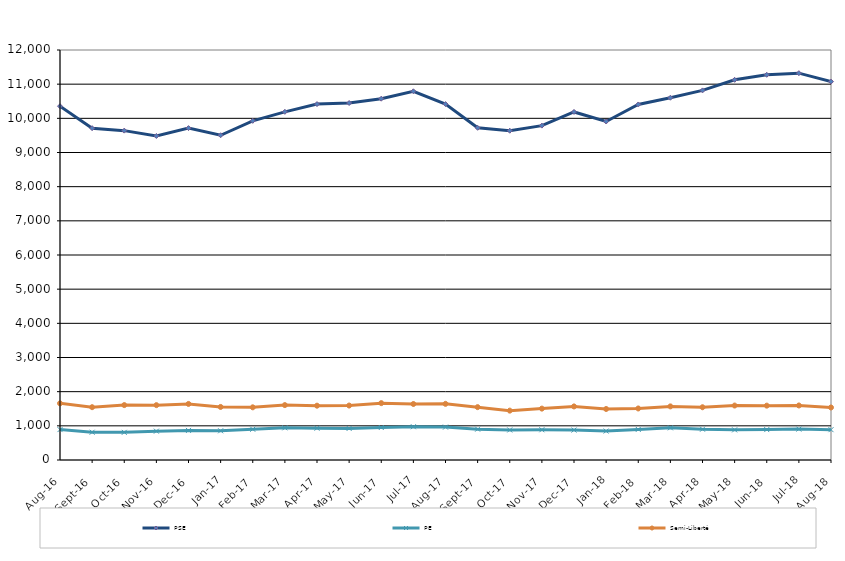
| Category | PSE | PE | Semi-Liberté |
|---|---|---|---|
| 2016-08-01 | 10355 | 890 | 1658 |
| 2016-09-01 | 9712 | 813 | 1546 |
| 2016-10-01 | 9640 | 809 | 1607 |
| 2016-11-01 | 9484 | 844 | 1605 |
| 2016-12-01 | 9714 | 866 | 1641 |
| 2017-01-01 | 9505 | 855 | 1553 |
| 2017-02-01 | 9927 | 900 | 1542 |
| 2017-03-01 | 10190 | 942 | 1607 |
| 2017-04-01 | 10417 | 931 | 1590 |
| 2017-05-01 | 10448 | 924 | 1594 |
| 2017-06-01 | 10575 | 951 | 1664 |
| 2017-07-01 | 10791 | 974 | 1639 |
| 2017-08-01 | 10417 | 963 | 1644 |
| 2017-09-01 | 9723 | 903 | 1547 |
| 2017-10-01 | 9637 | 879 | 1445 |
| 2017-11-01 | 9787 | 885 | 1504 |
| 2017-12-01 | 10187 | 876 | 1568 |
| 2018-01-01 | 9907 | 847 | 1493 |
| 2018-02-01 | 10406 | 895 | 1508 |
| 2018-03-01 | 10603 | 942 | 1569 |
| 2018-04-01 | 10817 | 901 | 1544 |
| 2018-05-01 | 11127 | 882 | 1594 |
| 2018-06-01 | 11275 | 890 | 1591 |
| 2018-07-01 | 11322 | 905 | 1596 |
| 2018-08-01 | 11075 | 888 | 1537 |